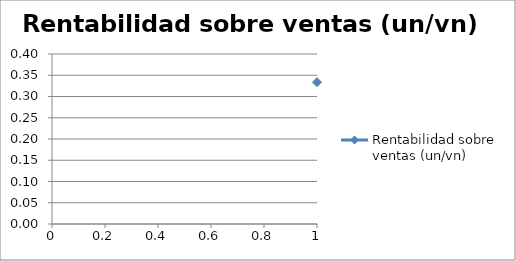
| Category | Rentabilidad sobre ventas (un/vn) |
|---|---|
| 0 | 0.334 |
| 1 | 0.334 |
| 2 | 0.334 |
| 3 | 0.334 |
| 4 | 0.334 |
| 5 | 0.334 |
| 6 | 0.334 |
| 7 | 0.334 |